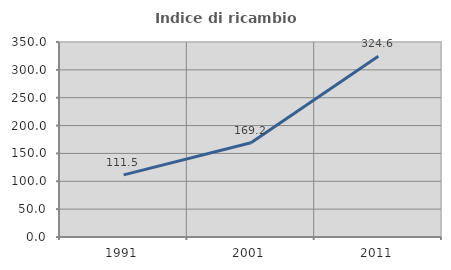
| Category | Indice di ricambio occupazionale  |
|---|---|
| 1991.0 | 111.494 |
| 2001.0 | 169.189 |
| 2011.0 | 324.576 |